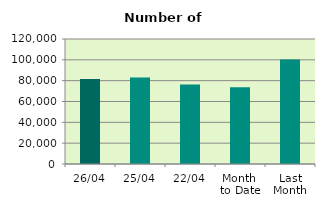
| Category | Series 0 |
|---|---|
| 26/04 | 81542 |
| 25/04 | 83048 |
| 22/04 | 76378 |
| Month 
to Date | 73730.25 |
| Last
Month | 100276.783 |